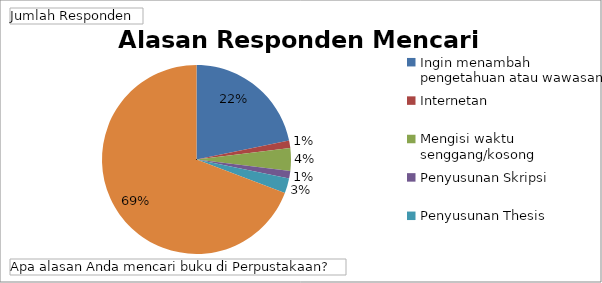
| Category | Total |
|---|---|
| Ingin menambah pengetahuan atau wawasan | 17 |
| Internetan | 1 |
| Mengisi waktu senggang/kosong | 3 |
| Penyusunan Skripsi | 1 |
| Penyusunan Thesis | 2 |
| Tugas dari perkuliahan | 54 |